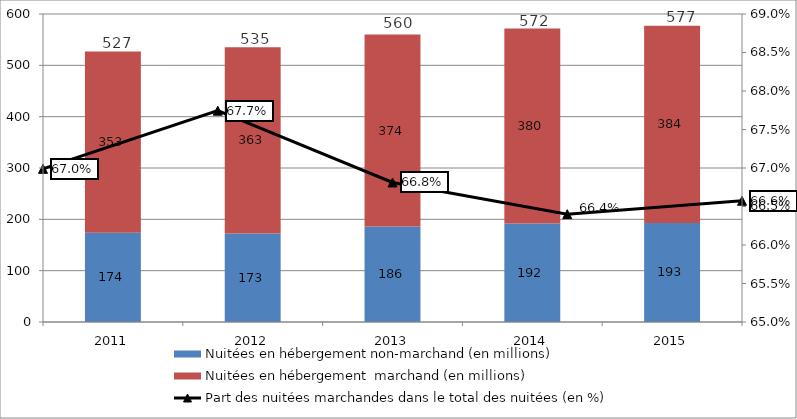
| Category | Nuitées en hébergement non-marchand (en millions) | Nuitées en hébergement  marchand (en millions) |
|---|---|---|
| 2011.0 | 173.915 | 352.928 |
| 2012.0 | 172.627 | 362.561 |
| 2013.0 | 185.809 | 374.061 |
| 2014.0 | 192.071 | 379.58 |
| 2015.0 | 192.937 | 384.274 |